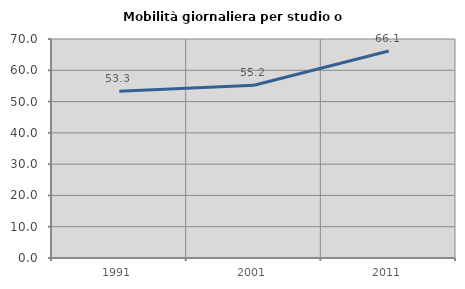
| Category | Mobilità giornaliera per studio o lavoro |
|---|---|
| 1991.0 | 53.302 |
| 2001.0 | 55.233 |
| 2011.0 | 66.14 |